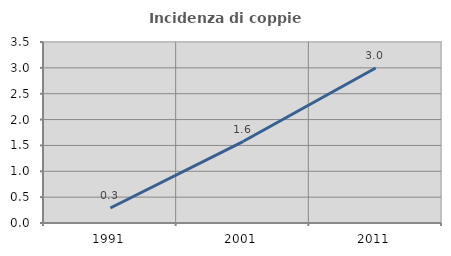
| Category | Incidenza di coppie miste |
|---|---|
| 1991.0 | 0.29 |
| 2001.0 | 1.575 |
| 2011.0 | 2.997 |